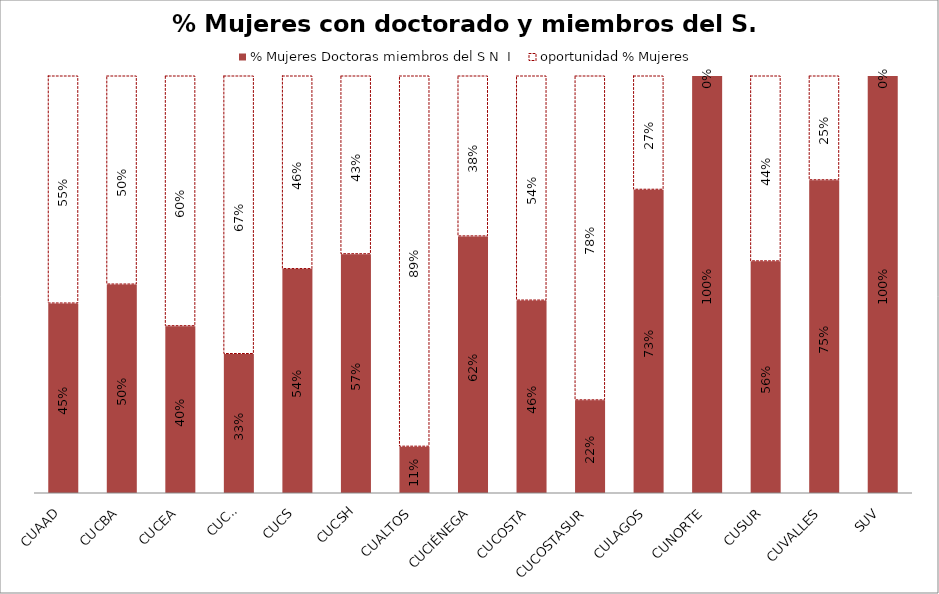
| Category | % Mujeres Doctoras miembros del S N  I | oportunidad % Mujeres |
|---|---|---|
| CUAAD | 0.455 | 0.545 |
| CUCBA | 0.5 | 0.5 |
| CUCEA | 0.4 | 0.6 |
| CUCEI | 0.333 | 0.667 |
| CUCS | 0.537 | 0.463 |
| CUCSH | 0.573 | 0.427 |
| CUALTOS | 0.111 | 0.889 |
| CUCIÉNEGA | 0.615 | 0.385 |
| CUCOSTA | 0.462 | 0.538 |
| CUCOSTASUR | 0.222 | 0.778 |
| CULAGOS | 0.727 | 0.273 |
| CUNORTE | 1 | 0 |
| CUSUR | 0.556 | 0.444 |
| CUVALLES | 0.75 | 0.25 |
| SUV | 1 | 0 |